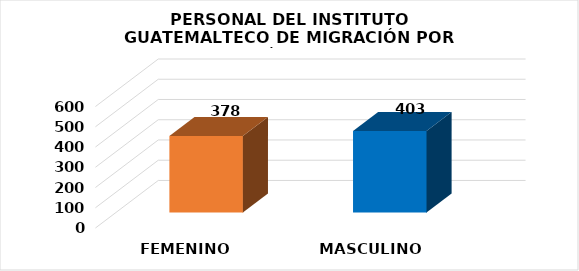
| Category | Series 0 |
|---|---|
| FEMENINO | 378 |
| MASCULINO | 403 |